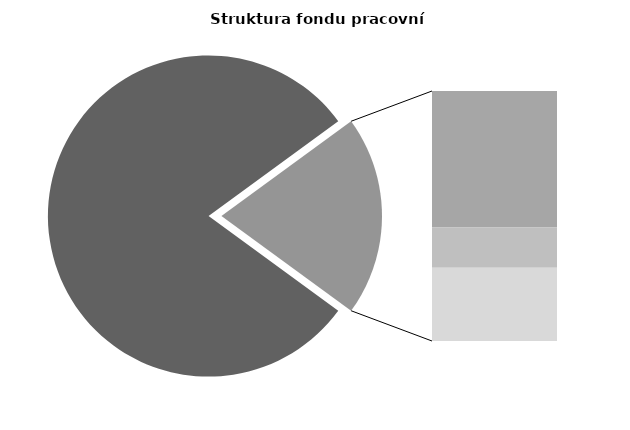
| Category | Series 0 |
|---|---|
| Průměrná měsíční odpracovaná doba bez přesčasu | 138.235 |
| Dovolená | 18.956 |
| Nemoc | 5.593 |
| Jiné | 10.196 |